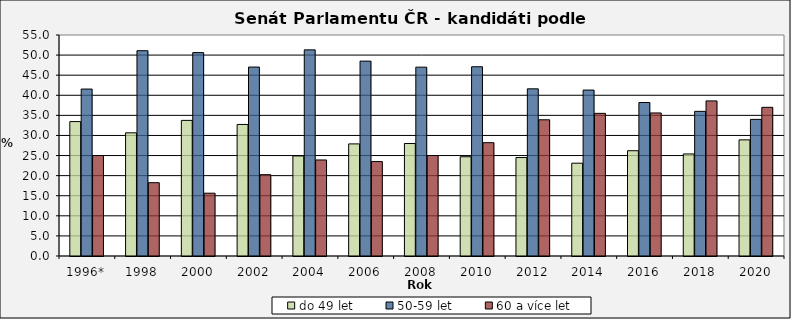
| Category | do 49 let | 50-59 let | 60 a více let |
|---|---|---|---|
| 1996* | 33.45 | 41.549 | 25 |
| 1998 | 30.657 | 51.095 | 18.248 |
| 2000 | 33.75 | 50.62 | 15.63 |
| 2002 | 32.738 | 47.024 | 20.238 |
| 2004 | 24.9 | 51.3 | 23.9 |
| 2006 | 27.9 | 48.5 | 23.5 |
| 2008 | 28 | 47 | 25 |
| 2010 | 24.7 | 47.1 | 28.2 |
| 2012 | 24.5 | 41.6 | 33.9 |
| 2014 | 23.1 | 41.3 | 35.5 |
| 2016 | 26.2 | 38.2 | 35.6 |
| 2018 | 25.4 | 36 | 38.6 |
| 2020 | 28.9 | 34 | 37 |